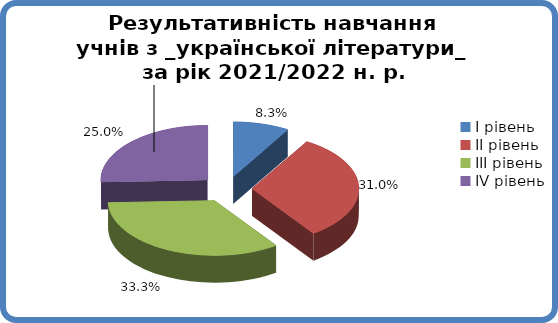
| Category | Series 0 |
|---|---|
| 0 | 0.083 |
| 1 | 0.31 |
| 2 | 0.333 |
| 3 | 0.25 |